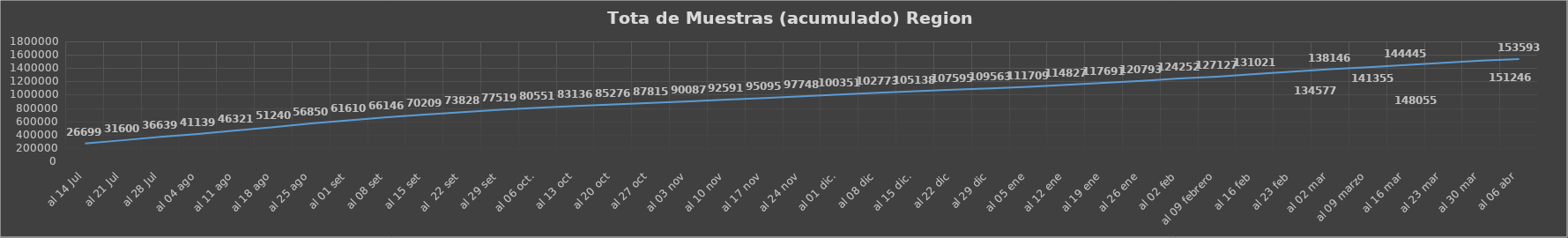
| Category | Series 0 |
|---|---|
| al 14 Jul | 266999 |
| al 21 Jul | 316006 |
| al 28 Jul | 366390 |
| al 04 ago | 411395 |
| al 11 ago | 463219 |
| al 18 ago | 512400 |
| al 25 ago | 568508 |
| al 01 set | 616104 |
| al 08 set | 661464 |
| al 15 set | 702099 |
| al  22 set | 738280 |
| al 29 set | 775193 |
| al 06 oct. | 805516 |
| al 13 oct | 831368 |
| al 20 oct | 852760 |
| al 27 oct | 878156 |
| al 03 nov | 900872 |
| al 10 nov | 925918 |
| al 17 nov | 950955 |
| al 24 nov | 977488 |
| al 01 dic. | 1003514 |
| al 08 dic | 1027730 |
| al 15 dic. | 1051385 |
| al 22 dic | 1075955 |
| al 29 dic | 1095633 |
| al 05 ene | 1117099 |
| al 12 ene | 1148275 |
| al 19 ene | 1176918 |
| al 26 ene | 1207933 |
| al 02 feb | 1242522 |
| al 09 febrero | 1271270 |
| al 16 feb | 1310217 |
| al 23 feb | 1345770 |
| al 02 mar | 1381461 |
| al 09 marzo | 1413550 |
| al 16 mar | 1444450 |
| al 23 mar | 1480555 |
| al 30 mar | 1512467 |
| al 06 abr | 1535938 |